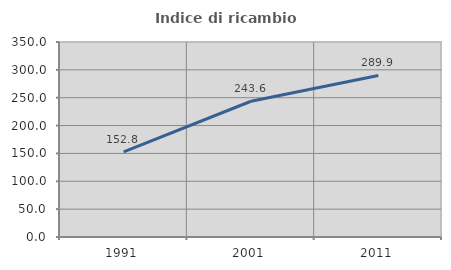
| Category | Indice di ricambio occupazionale  |
|---|---|
| 1991.0 | 152.809 |
| 2001.0 | 243.64 |
| 2011.0 | 289.946 |